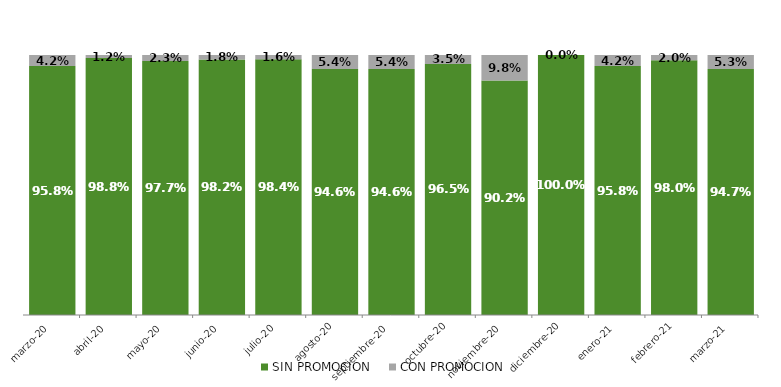
| Category | SIN PROMOCION   | CON PROMOCION   |
|---|---|---|
| 2020-03-01 | 0.958 | 0.042 |
| 2020-04-01 | 0.988 | 0.012 |
| 2020-05-01 | 0.977 | 0.023 |
| 2020-06-01 | 0.982 | 0.018 |
| 2020-07-01 | 0.984 | 0.016 |
| 2020-08-01 | 0.946 | 0.054 |
| 2020-09-01 | 0.946 | 0.054 |
| 2020-10-01 | 0.965 | 0.035 |
| 2020-11-01 | 0.902 | 0.098 |
| 2020-12-01 | 1 | 0 |
| 2021-01-01 | 0.958 | 0.042 |
| 2021-02-01 | 0.98 | 0.02 |
| 2021-03-01 | 0.947 | 0.053 |